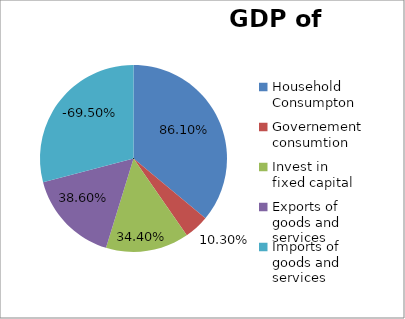
| Category | Series 0 |
|---|---|
| Household Consumpton | 0.861 |
| Governement consumtion | 0.103 |
| Invest in fixed capital | 0.344 |
| Exports of goods and services | 0.386 |
| Imports of goods and services | -0.695 |